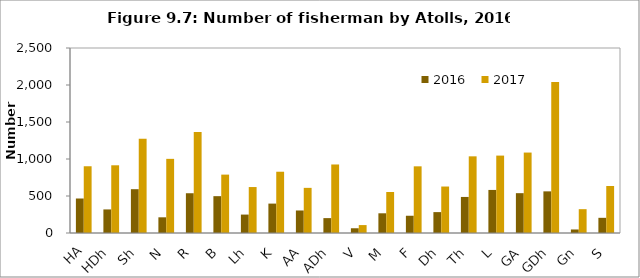
| Category | 2016 | 2017 |
|---|---|---|
| HA | 466.188 | 902 |
| HDh | 318.584 | 915 |
| Sh | 592.048 | 1274 |
| N | 212.018 | 1002 |
| R | 537.318 | 1364 |
| B | 497.875 | 789 |
| Lh | 248.938 | 621 |
| K | 397.395 | 828 |
| AA | 304.298 | 610 |
| ADh | 201.146 | 926 |
| V | 64.117 | 107 |
| M | 266.34 | 554 |
| F | 233.168 | 901 |
| Dh | 282.258 | 628 |
| Th | 487.226 | 1036 |
| L | 581.918 | 1046 |
| GA | 538.246 | 1087 |
| GDh | 562.698 | 2042 |
| Gn | 47.643 | 322 |
| S | 205.154 | 635 |